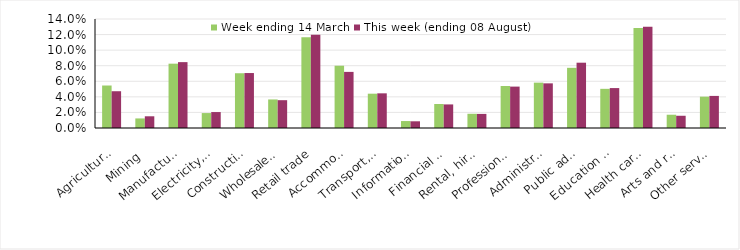
| Category | Week ending 14 March | This week (ending 08 August) |
|---|---|---|
| Agriculture, forestry and fishing | 0.055 | 0.047 |
| Mining | 0.012 | 0.015 |
| Manufacturing | 0.083 | 0.085 |
| Electricity, gas, water and waste services | 0.019 | 0.02 |
| Construction | 0.07 | 0.071 |
| Wholesale trade | 0.037 | 0.036 |
| Retail trade | 0.117 | 0.12 |
| Accommodation and food services | 0.08 | 0.072 |
| Transport, postal and warehousing | 0.044 | 0.045 |
| Information media and telecommunications | 0.009 | 0.009 |
| Financial and insurance services | 0.031 | 0.03 |
| Rental, hiring and real estate services | 0.018 | 0.018 |
| Professional, scientific and technical services | 0.054 | 0.053 |
| Administrative and support services | 0.058 | 0.057 |
| Public administration and safety | 0.077 | 0.084 |
| Education and training | 0.05 | 0.051 |
| Health care and social assistance | 0.128 | 0.13 |
| Arts and recreation services | 0.017 | 0.016 |
| Other services | 0.04 | 0.041 |